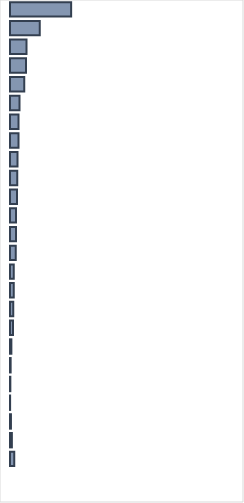
| Category | Series 0 |
|---|---|
| 0 | 26.935 |
| 1 | 13.113 |
| 2 | 7.272 |
| 3 | 7.042 |
| 4 | 6.226 |
| 5 | 4.196 |
| 6 | 3.784 |
| 7 | 3.783 |
| 8 | 3.358 |
| 9 | 3.19 |
| 10 | 3.039 |
| 11 | 2.686 |
| 12 | 2.612 |
| 13 | 2.482 |
| 14 | 1.688 |
| 15 | 1.65 |
| 16 | 1.431 |
| 17 | 1.275 |
| 18 | 0.604 |
| 19 | 0.283 |
| 20 | 0.149 |
| 21 | 0.048 |
| 22 | 0.419 |
| 23 | 0.829 |
| 24 | 1.905 |
| 25 | 0 |